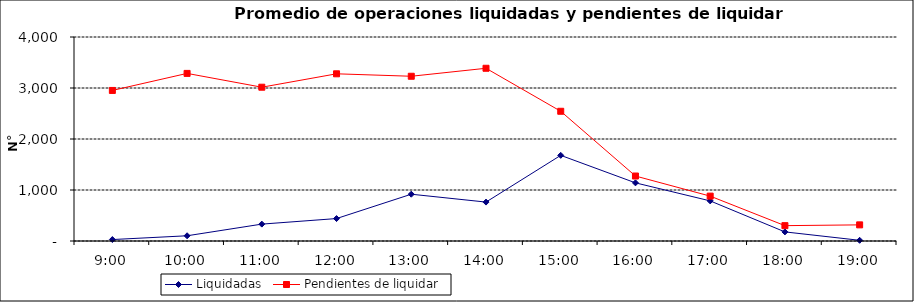
| Category | Liquidadas | Pendientes de liquidar |
|---|---|---|
| 0.375 | 28.429 | 2951.905 |
| 0.4166666666666667 | 102.381 | 3286.429 |
| 0.4583333333333333 | 331.143 | 3015.333 |
| 0.5 | 440.19 | 3278.238 |
| 0.5416666666666666 | 917.571 | 3230.19 |
| 0.5833333333333334 | 763.048 | 3386.905 |
| 0.625 | 1679.476 | 2543.619 |
| 0.6666666666666666 | 1140.048 | 1273.952 |
| 0.7083333333333334 | 786.429 | 880.095 |
| 0.75 | 178.381 | 301.143 |
| 0.7916666666666666 | 13.714 | 316.381 |